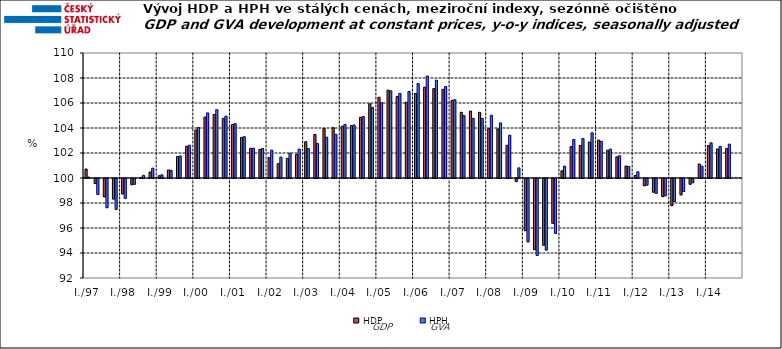
| Category | HDP

 | HPH

 |
|---|---|---|
| I./97 | 100.719 | 100.078 |
|  | 99.595 | 98.722 |
|  | 98.534 | 97.665 |
|  | 98.357 | 97.533 |
| I./98 | 98.767 | 98.409 |
|  | 99.507 | 99.536 |
|  | 100.056 | 100.215 |
|  | 100.477 | 100.79 |
| I./99 | 100.184 | 100.255 |
|  | 100.641 | 100.613 |
|  | 101.719 | 101.764 |
|  | 102.543 | 102.623 |
| I./00 | 103.839 | 104.038 |
|  | 104.879 | 105.209 |
|  | 105.081 | 105.463 |
|  | 104.766 | 104.949 |
| I./01 | 104.286 | 104.349 |
|  | 103.251 | 103.304 |
|  | 102.376 | 102.387 |
|  | 102.289 | 102.357 |
| I./02 | 101.649 | 102.23 |
|  | 101.143 | 101.673 |
|  | 101.57 | 101.981 |
|  | 101.879 | 102.308 |
| I./03 | 102.903 | 102.359 |
|  | 103.49 | 102.756 |
|  | 103.973 | 103.265 |
|  | 104.02 | 103.498 |
| I./04 | 104.144 | 104.283 |
|  | 104.194 | 104.242 |
|  | 104.858 | 104.915 |
|  | 105.936 | 105.641 |
| I./05 | 106.461 | 106.023 |
|  | 107.028 | 106.978 |
|  | 106.527 | 106.768 |
|  | 106.058 | 106.921 |
| I./06 | 106.765 | 107.557 |
|  | 107.271 | 108.159 |
|  | 107.149 | 107.824 |
|  | 107.092 | 107.32 |
| I./07 | 106.219 | 106.262 |
|  | 105.256 | 104.989 |
|  | 105.353 | 104.776 |
|  | 105.253 | 104.762 |
| I./08 | 103.944 | 105.02 |
|  | 103.926 | 104.405 |
|  | 102.618 | 103.426 |
|  | 99.755 | 100.81 |
| I./09 | 95.828 | 94.929 |
|  | 94.31 | 93.851 |
|  | 94.667 | 94.276 |
|  | 96.414 | 95.606 |
| I./10 | 100.577 | 100.947 |
|  | 102.519 | 103.079 |
|  | 102.598 | 103.157 |
|  | 102.874 | 103.616 |
| I./11 | 103.033 | 102.931 |
|  | 102.227 | 102.316 |
|  | 101.692 | 101.781 |
|  | 100.959 | 100.93 |
| I./12 | 100.2 | 100.496 |
|  | 99.425 | 99.48 |
|  | 98.904 | 98.813 |
|  | 98.554 | 98.618 |
| I./13 | 97.833 | 98.157 |
|  | 98.694 | 98.96 |
|  | 99.541 | 99.662 |
|  | 101.121 | 100.945 |
| I./14 | 102.595 | 102.814 |